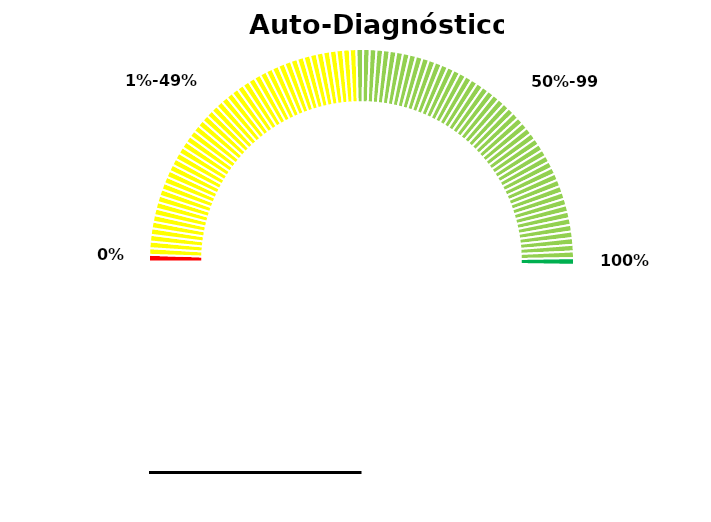
| Category | Series 0 |
|---|---|
| 0 | 1 |
| 1 | 1 |
| 2 | 1 |
| 3 | 1 |
| 4 | 1 |
| 5 | 1 |
| 6 | 1 |
| 7 | 1 |
| 8 | 1 |
| 9 | 1 |
| 10 | 1 |
| 11 | 1 |
| 12 | 1 |
| 13 | 1 |
| 14 | 1 |
| 15 | 1 |
| 16 | 1 |
| 17 | 1 |
| 18 | 1 |
| 19 | 1 |
| 20 | 1 |
| 21 | 1 |
| 22 | 1 |
| 23 | 1 |
| 24 | 1 |
| 25 | 1 |
| 26 | 1 |
| 27 | 1 |
| 28 | 1 |
| 29 | 1 |
| 30 | 1 |
| 31 | 1 |
| 32 | 1 |
| 33 | 1 |
| 34 | 1 |
| 35 | 1 |
| 36 | 1 |
| 37 | 1 |
| 38 | 1 |
| 39 | 1 |
| 40 | 1 |
| 41 | 1 |
| 42 | 1 |
| 43 | 1 |
| 44 | 1 |
| 45 | 1 |
| 46 | 1 |
| 47 | 1 |
| 48 | 1 |
| 49 | 1 |
| 50 | 1 |
| 51 | 1 |
| 52 | 1 |
| 53 | 1 |
| 54 | 1 |
| 55 | 1 |
| 56 | 1 |
| 57 | 1 |
| 58 | 1 |
| 59 | 1 |
| 60 | 1 |
| 61 | 1 |
| 62 | 1 |
| 63 | 1 |
| 64 | 1 |
| 65 | 1 |
| 66 | 1 |
| 67 | 1 |
| 68 | 1 |
| 69 | 1 |
| 70 | 1 |
| 71 | 1 |
| 72 | 1 |
| 73 | 1 |
| 74 | 1 |
| 75 | 1 |
| 76 | 1 |
| 77 | 1 |
| 78 | 1 |
| 79 | 1 |
| 80 | 1 |
| 81 | 1 |
| 82 | 1 |
| 83 | 1 |
| 84 | 1 |
| 85 | 1 |
| 86 | 1 |
| 87 | 1 |
| 88 | 1 |
| 89 | 1 |
| 90 | 1 |
| 91 | 1 |
| 92 | 1 |
| 93 | 1 |
| 94 | 1 |
| 95 | 1 |
| 96 | 1 |
| 97 | 1 |
| 98 | 1 |
| 99 | 1 |
| 100 | 99 |